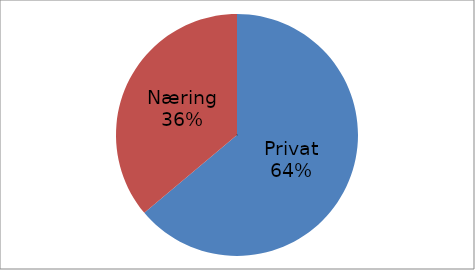
| Category | Series 0 |
|---|---|
| Privat | 35775804 |
| Næring | 20222058 |